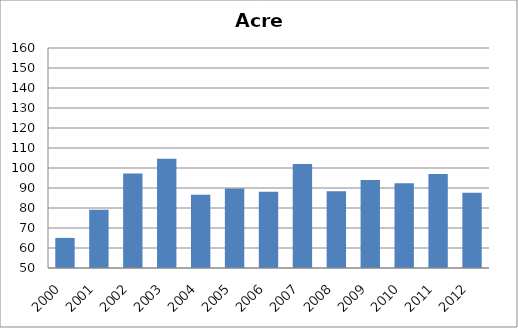
| Category | Tetravalente/DTP |
|---|---|
| 2000.0 | 65.06 |
| 2001.0 | 79.12 |
| 2002.0 | 97.3 |
| 2003.0 | 104.58 |
| 2004.0 | 86.59 |
| 2005.0 | 89.71 |
| 2006.0 | 88.14 |
| 2007.0 | 102.03 |
| 2008.0 | 88.35 |
| 2009.0 | 93.94 |
| 2010.0 | 92.41 |
| 2011.0 | 96.95 |
| 2012.0 | 87.57 |